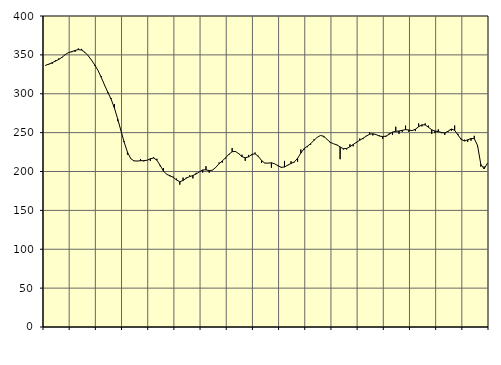
| Category | Piggar | Series 1 |
|---|---|---|
| nan | 336 | 336.66 |
| 87.0 | 337.6 | 338.16 |
| 87.0 | 338.5 | 340.03 |
| 87.0 | 343 | 341.93 |
| nan | 345.4 | 344.09 |
| 88.0 | 346.4 | 346.92 |
| 88.0 | 350.9 | 350.33 |
| 88.0 | 353.2 | 352.93 |
| nan | 353.4 | 354.25 |
| 89.0 | 353.9 | 355.66 |
| 89.0 | 358.2 | 356.79 |
| 89.0 | 357.7 | 356.17 |
| nan | 352.9 | 353.35 |
| 90.0 | 349 | 348.86 |
| 90.0 | 343.6 | 343.34 |
| 90.0 | 336 | 337.11 |
| nan | 329.9 | 329.97 |
| 91.0 | 322.6 | 321.11 |
| 91.0 | 310.9 | 311.19 |
| 91.0 | 300.9 | 302.03 |
| nan | 294.5 | 293.12 |
| 92.0 | 286.7 | 281.9 |
| 92.0 | 264.8 | 267.96 |
| 92.0 | 253.2 | 252.74 |
| nan | 238.9 | 237.69 |
| 93.0 | 221.7 | 224.97 |
| 93.0 | 217.1 | 216.64 |
| 93.0 | 213.4 | 213.64 |
| nan | 213.3 | 213.47 |
| 94.0 | 216.1 | 213.87 |
| 94.0 | 213 | 213.98 |
| 94.0 | 214.4 | 214.43 |
| nan | 213.6 | 216.37 |
| 95.0 | 218.4 | 217.34 |
| 95.0 | 216.3 | 214.56 |
| 95.0 | 206.8 | 207.89 |
| nan | 204.5 | 200.66 |
| 96.0 | 196.2 | 196.39 |
| 96.0 | 193.8 | 194.58 |
| 96.0 | 193.3 | 192.5 |
| nan | 190.8 | 189.12 |
| 97.0 | 183.1 | 186.9 |
| 97.0 | 192.1 | 188.38 |
| 97.0 | 192.3 | 191.44 |
| nan | 195.1 | 193.43 |
| 98.0 | 191.1 | 194.8 |
| 98.0 | 198.3 | 196.79 |
| 98.0 | 199.4 | 199.56 |
| nan | 198.7 | 202.01 |
| 99.0 | 206.8 | 202.13 |
| 99.0 | 198.4 | 201.12 |
| 99.0 | 202 | 201.77 |
| nan | 205.1 | 205.29 |
| 0.0 | 211.5 | 210.01 |
| 0.0 | 211.4 | 213.66 |
| 0.0 | 216.7 | 217.59 |
| nan | 221.4 | 222.16 |
| 1.0 | 230.1 | 225.44 |
| 1.0 | 225.3 | 225.83 |
| 1.0 | 223.5 | 222.92 |
| nan | 221.6 | 219.23 |
| 2.0 | 213.7 | 217.64 |
| 2.0 | 221.3 | 218.81 |
| 2.0 | 220.9 | 221.96 |
| nan | 224.4 | 222.83 |
| 3.0 | 220.2 | 219.38 |
| 3.0 | 211.1 | 214.11 |
| 3.0 | 211 | 210.76 |
| nan | 210.7 | 210.83 |
| 4.0 | 204.8 | 211.22 |
| 4.0 | 209.8 | 209.9 |
| 4.0 | 206.9 | 207.5 |
| nan | 204.8 | 205.42 |
| 5.0 | 213.6 | 205.74 |
| 5.0 | 207.7 | 208.26 |
| 5.0 | 213.1 | 210.27 |
| nan | 211.8 | 212.3 |
| 6.0 | 212.5 | 216.96 |
| 6.0 | 228.3 | 223.73 |
| 6.0 | 228 | 229.35 |
| nan | 231.3 | 232.49 |
| 7.0 | 234.6 | 235.78 |
| 7.0 | 241.4 | 240.04 |
| 7.0 | 243.9 | 243.98 |
| nan | 246.3 | 246.33 |
| 8.0 | 244 | 245.26 |
| 8.0 | 241.4 | 241.34 |
| 8.0 | 236.6 | 237.49 |
| nan | 235.7 | 235.68 |
| 9.0 | 233.9 | 234.27 |
| 9.0 | 215.8 | 231.54 |
| 9.0 | 228.3 | 229.32 |
| nan | 228.3 | 229.63 |
| 10.0 | 235 | 231.83 |
| 10.0 | 232.4 | 234.76 |
| 10.0 | 236.8 | 237.6 |
| nan | 242.3 | 240.26 |
| 11.0 | 241.6 | 242.76 |
| 11.0 | 246 | 245.48 |
| 11.0 | 250.4 | 247.93 |
| nan | 246.4 | 248.6 |
| 12.0 | 247.4 | 247.46 |
| 12.0 | 246.4 | 245.59 |
| 12.0 | 242.1 | 244.88 |
| nan | 244.6 | 245.5 |
| 13.0 | 249 | 247.92 |
| 13.0 | 247.2 | 250.7 |
| 13.0 | 257.6 | 251.62 |
| nan | 248.5 | 252.1 |
| 14.0 | 251 | 253 |
| 14.0 | 259 | 253.87 |
| 14.0 | 251.1 | 253.36 |
| nan | 252.5 | 252.6 |
| 15.0 | 252 | 254.35 |
| 15.0 | 261.7 | 257.63 |
| 15.0 | 258 | 259.99 |
| nan | 261.8 | 259.9 |
| 16.0 | 259 | 256.88 |
| 16.0 | 248.4 | 253.58 |
| 16.0 | 249.3 | 252.04 |
| nan | 254.2 | 251.24 |
| 17.0 | 249.3 | 250.18 |
| 17.0 | 247.1 | 249.63 |
| 17.0 | 251 | 251.87 |
| nan | 252.4 | 254.66 |
| 18.0 | 259.2 | 252.96 |
| 18.0 | 248.5 | 247.08 |
| 18.0 | 242.3 | 241.22 |
| nan | 240.9 | 239.27 |
| 19.0 | 238.2 | 240.73 |
| 19.0 | 239.6 | 242.39 |
| 19.0 | 245.9 | 242.3 |
| nan | 232.3 | 233.38 |
| 20.0 | 206.3 | 209.22 |
| 20.0 | 206.5 | 203.43 |
| 20.0 | 210.9 | 210.4 |